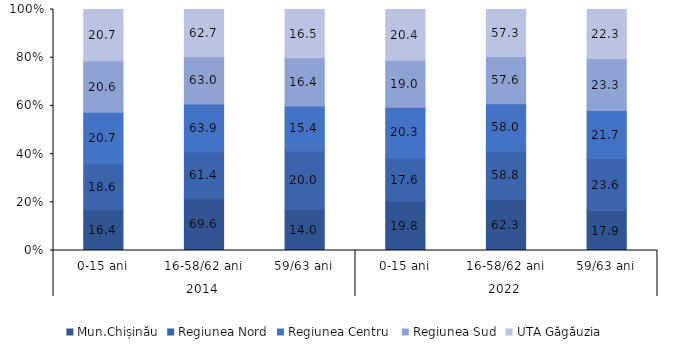
| Category | Mun.Chișinău | Regiunea Nord | Regiunea Centru  | Regiunea Sud | UTA Găgăuzia |
|---|---|---|---|---|---|
| 0 | 16.356 | 18.572 | 20.703 | 20.575 | 20.736 |
| 1 | 69.622 | 61.418 | 63.884 | 63.003 | 62.732 |
| 2 | 14.022 | 20.01 | 15.413 | 16.422 | 16.532 |
| 3 | 19.83 | 17.625 | 20.306 | 19.028 | 20.439 |
| 4 | 62.317 | 58.78 | 58.04 | 57.635 | 57.29 |
| 5 | 17.853 | 23.595 | 21.655 | 23.338 | 22.271 |